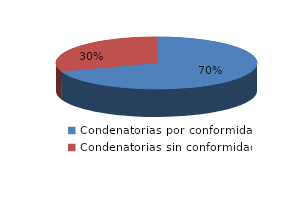
| Category | Series 0 |
|---|---|
| 0 | 520 |
| 1 | 227 |